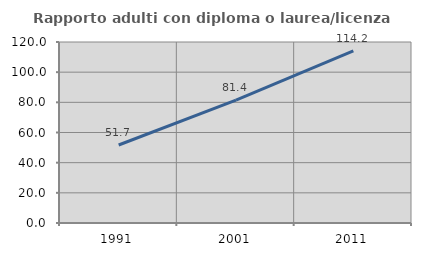
| Category | Rapporto adulti con diploma o laurea/licenza media  |
|---|---|
| 1991.0 | 51.713 |
| 2001.0 | 81.447 |
| 2011.0 | 114.188 |